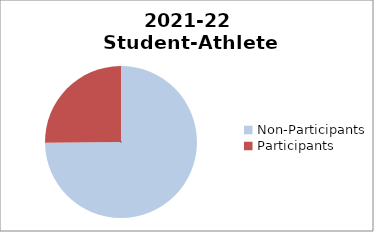
| Category | 2015-16 Student-Athlete Participation (Male) |
|---|---|
| Non-Participants | 1017 |
| Participants | 342 |